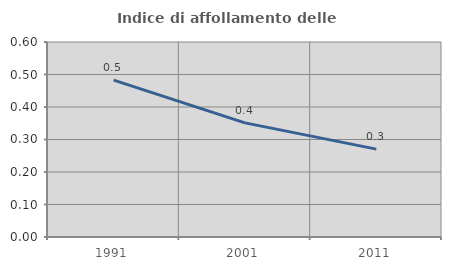
| Category | Indice di affollamento delle abitazioni  |
|---|---|
| 1991.0 | 0.483 |
| 2001.0 | 0.351 |
| 2011.0 | 0.27 |